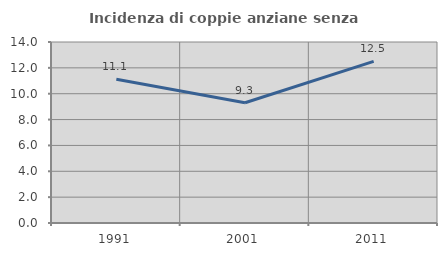
| Category | Incidenza di coppie anziane senza figli  |
|---|---|
| 1991.0 | 11.111 |
| 2001.0 | 9.302 |
| 2011.0 | 12.5 |